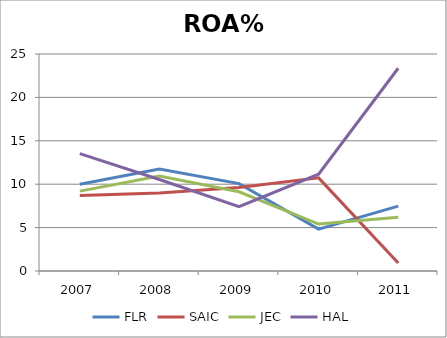
| Category | FLR | SAIC | JEC | HAL |
|---|---|---|---|---|
| 2007.0 | 10 | 8.7 | 9.2 | 13.53 |
| 2008.0 | 11.76 | 8.99 | 10.94 | 10.54 |
| 2009.0 | 10.07 | 9.61 | 9.13 | 7.41 |
| 2010.0 | 4.83 | 10.73 | 5.41 | 11.15 |
| 2011.0 | 7.48 | 0.92 | 6.19 | 23.36 |